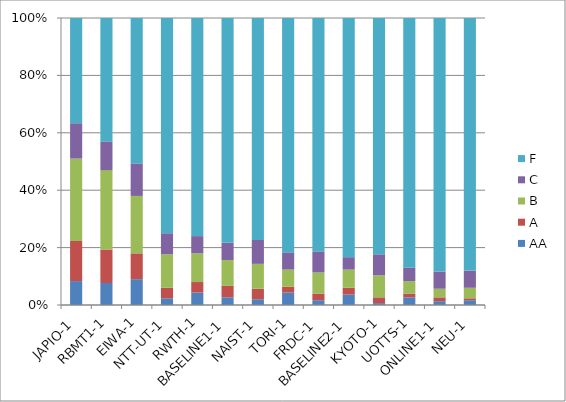
| Category | AA | A | B | C | F |
|---|---|---|---|---|---|
| JAPIO-1 | 25 | 42 | 86 | 37 | 110 |
| RBMT1-1 | 23 | 35 | 83 | 30 | 129 |
| EIWA-1 | 27 | 27 | 60 | 34 | 152 |
| NTT-UT-1 | 7 | 11 | 35 | 22 | 225 |
| RWTH-1 | 13 | 11 | 30 | 18 | 228 |
| BASELINE1-1 | 8 | 12 | 27 | 18 | 235 |
| NAIST-1 | 6 | 11 | 26 | 25 | 232 |
| TORI-1 | 13 | 6 | 18 | 18 | 245 |
| FRDC-1 | 5 | 7 | 22 | 22 | 244 |
| BASELINE2-1 | 11 | 7 | 19 | 13 | 250 |
| KYOTO-1 | 2 | 6 | 23 | 22 | 247 |
| UOTTS-1 | 8 | 4 | 13 | 14 | 261 |
| ONLINE1-1 | 4 | 4 | 9 | 18 | 265 |
| NEU-1 | 5 | 2 | 11 | 18 | 264 |